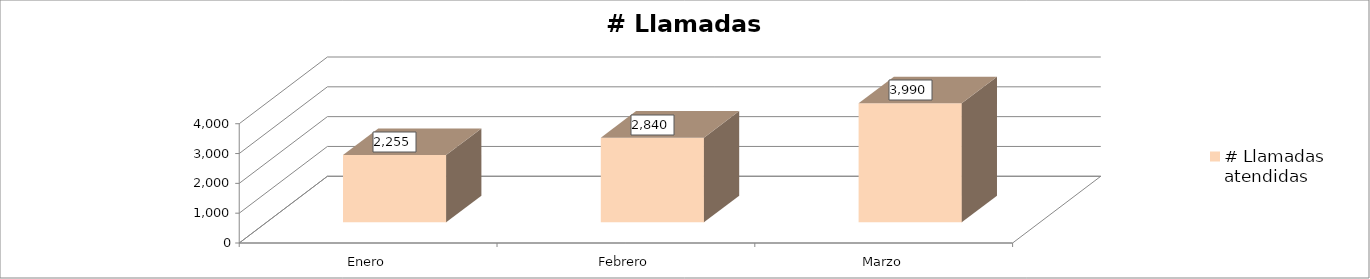
| Category | # Llamadas atendidas |
|---|---|
| Enero | 2255 |
| Febrero | 2840 |
| Marzo | 3990 |